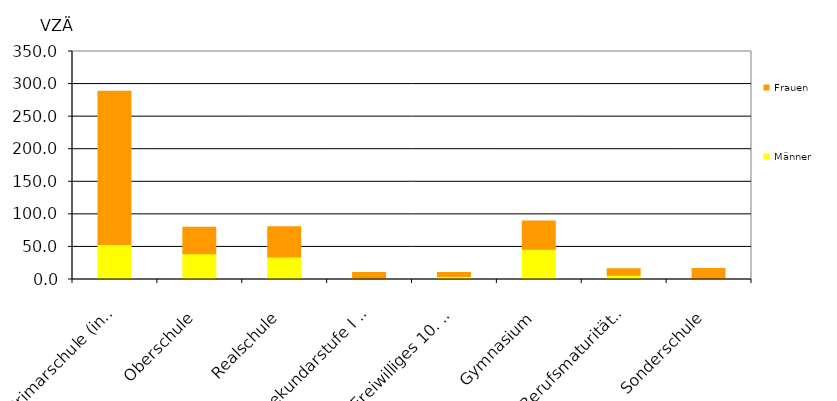
| Category | Männer | Frauen |
|---|---|---|
| Primarschule (inkl. Kindergarten) | 53.91 | 235.07 |
| Oberschule | 39.7 | 40.5 |
| Realschule | 34.48 | 46.33 |
| Sekundarstufe I (private) | 1.99 | 8.89 |
| Freiwilliges 10. Schuljahr | 4.59 | 6.06 |
| Gymnasium | 46.44 | 43.25 |
| Berufsmaturitätsschule | 6.44 | 10.19 |
| Sonderschule | 1.24 | 15.5 |